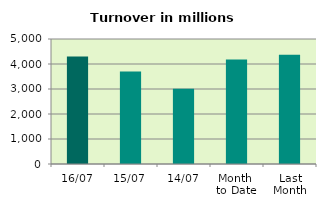
| Category | Series 0 |
|---|---|
| 16/07 | 4303.057 |
| 15/07 | 3695.581 |
| 14/07 | 3007.604 |
| Month 
to Date | 4180.109 |
| Last
Month | 4366.67 |